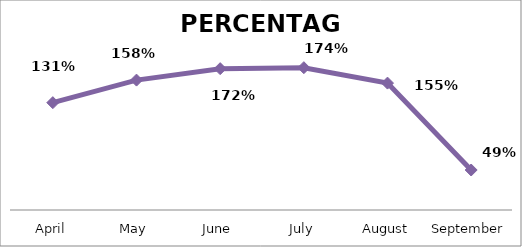
| Category | PERCENTAGE |
|---|---|
| April | 1.309 |
| May | 1.584 |
| June | 1.724 |
| July | 1.736 |
| August | 1.548 |
| September | 0.488 |